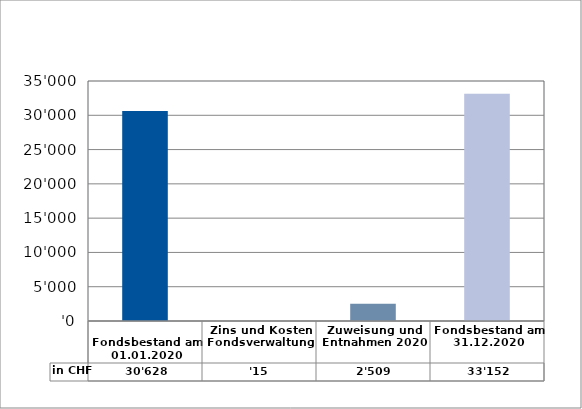
| Category | in CHF |
|---|---|
| 
Fondsbestand am 01.01.2020

 | 30628 |
| Zins und Kosten Fondsverwaltung | 15.3 |
| Zuweisung und Entnahmen 2020 | 2508.95 |
| Fondsbestand am 31.12.2020 | 33152.25 |